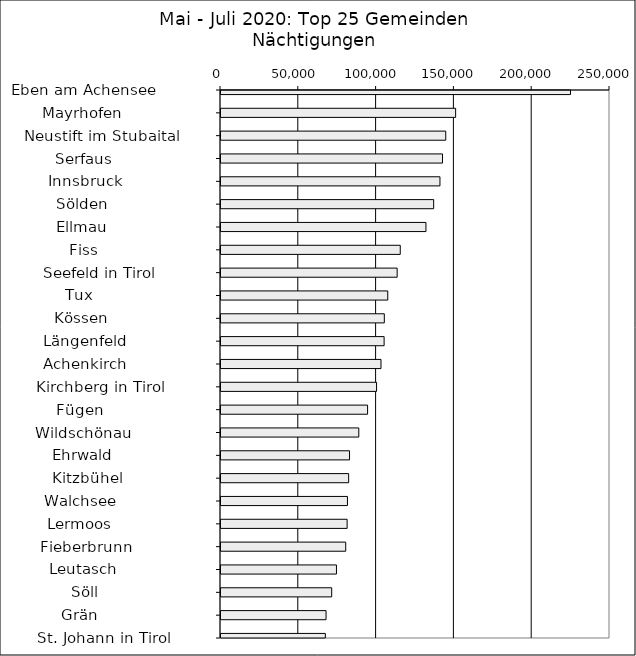
| Category | Series 0 |
|---|---|
|   Eben am Achensee           | 224627 |
|   Mayrhofen                  | 150794 |
|   Neustift im Stubaital      | 144439 |
|   Serfaus                    | 142353 |
|   Innsbruck                  | 140717 |
|   Sölden                     | 136670 |
|   Ellmau                     | 131717 |
|   Fiss                       | 115201 |
|   Seefeld in Tirol           | 113217 |
|   Tux                        | 107166 |
|   Kössen                     | 104958 |
|   Längenfeld                 | 104828 |
|   Achenkirch                 | 102826 |
|   Kirchberg in Tirol         | 99978 |
|   Fügen                      | 94206 |
|   Wildschönau                | 88551 |
|   Ehrwald                    | 82608 |
|   Kitzbühel                  | 82040 |
|   Walchsee                   | 81277 |
|   Lermoos                    | 81061 |
|   Fieberbrunn                | 80153 |
|   Leutasch                   | 74200 |
|   Söll                       | 71144 |
|   Grän                       | 67519 |
|   St. Johann in Tirol        | 67055 |